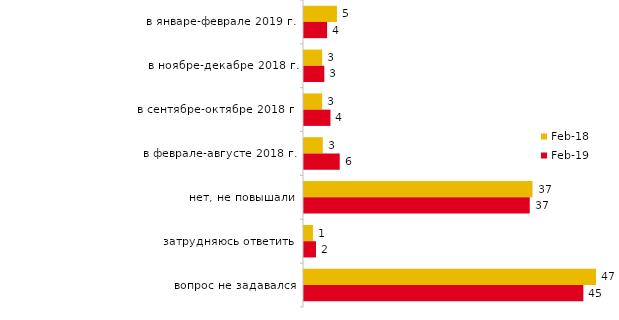
| Category | фев.18 | фев.19 |
|---|---|---|
| в январе-феврале 2019 г. | 5.35 | 3.75 |
| в ноябре-декабре 2018 г. | 2.95 | 3.3 |
| в сентябре-октябре 2018 г. | 2.95 | 4.3 |
| в феврале-августе 2018 г. | 3.05 | 5.8 |
| нет, не повышали | 37.1 | 36.65 |
| затрудняюсь ответить | 1.45 | 1.95 |
| вопрос не задавался | 47.4 | 45.35 |